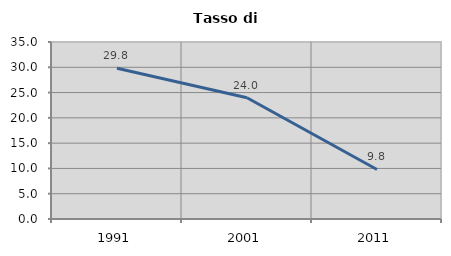
| Category | Tasso di disoccupazione   |
|---|---|
| 1991.0 | 29.804 |
| 2001.0 | 23.974 |
| 2011.0 | 9.8 |